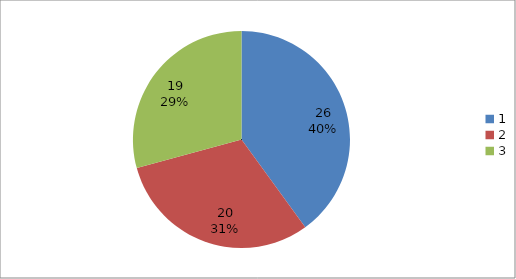
| Category | Series 0 |
|---|---|
| 0 | 26 |
| 1 | 20 |
| 2 | 19 |